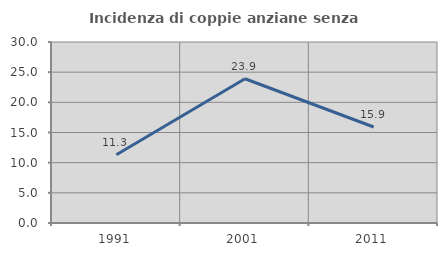
| Category | Incidenza di coppie anziane senza figli  |
|---|---|
| 1991.0 | 11.321 |
| 2001.0 | 23.913 |
| 2011.0 | 15.909 |